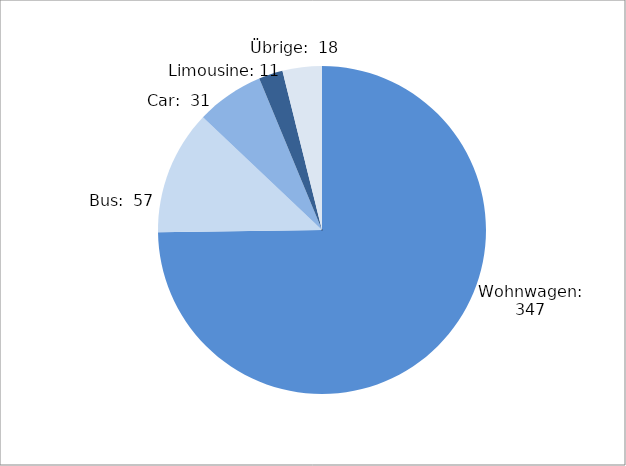
| Category | Series 0 |
|---|---|
| Wohnwagen | 347 |
| Bus | 57 |
| Car | 31 |
| Limousine | 11 |
| Übrige | 18 |